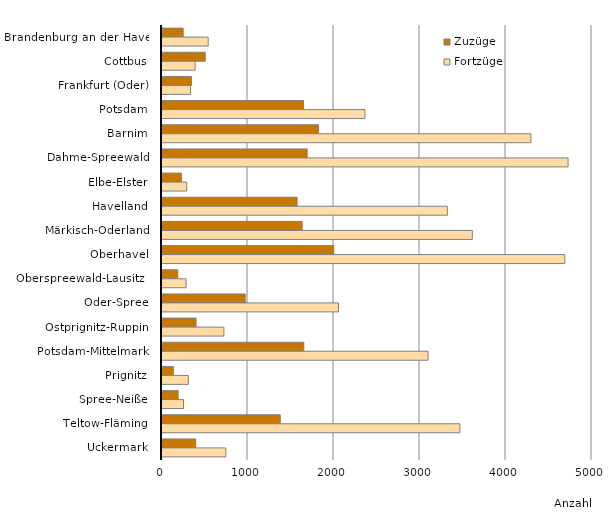
| Category | Zuzüge | Fortzüge |
|---|---|---|
| Brandenburg an der Havel | 246 | 537 |
| Cottbus | 503 | 385 |
| Frankfurt (Oder) | 342 | 331 |
| Potsdam | 1646 | 2360 |
| Barnim | 1820 | 4290 |
| Dahme-Spreewald | 1688 | 4722 |
| Elbe-Elster | 225 | 287 |
| Havelland | 1571 | 3318 |
| Märkisch-Oderland | 1630 | 3608 |
| Oberhavel | 1997 | 4684 |
| Oberspreewald-Lausitz   | 184 | 280 |
| Oder-Spree | 967 | 2052 |
| Ostprignitz-Ruppin | 396 | 720 |
| Potsdam-Mittelmark | 1649 | 3094 |
| Prignitz | 132 | 306 |
| Spree-Neiße | 188 | 250 |
| Teltow-Fläming | 1375 | 3464 |
| Uckermark | 392 | 742 |